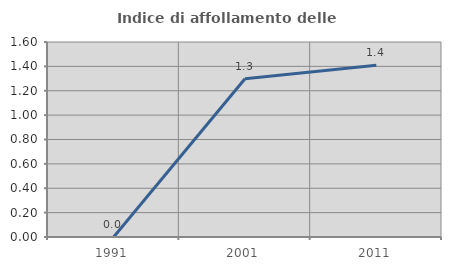
| Category | Indice di affollamento delle abitazioni  |
|---|---|
| 1991.0 | 0 |
| 2001.0 | 1.299 |
| 2011.0 | 1.408 |